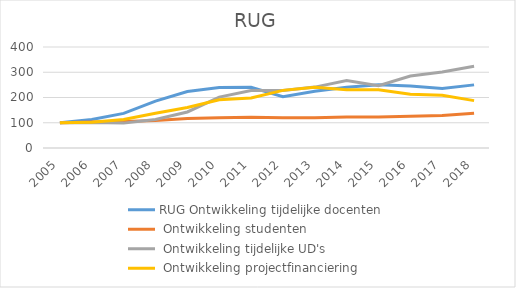
| Category | RUG Ontwikkeling tijdelijke docenten | RUG Ontwikkeling studenten | RUG Ontwikkeling tijdelijke UD's | RUG Ontwikkeling projectfinanciering |
|---|---|---|---|---|
| 2005.0 | 100 | 100 | 100 | 100 |
| 2006.0 | 113.043 | 103.266 | 101.471 | 102.313 |
| 2007.0 | 136.957 | 104.717 | 98.529 | 113.236 |
| 2008.0 | 185.87 | 109.385 | 113.235 | 137.719 |
| 2009.0 | 223.913 | 116.416 | 142.647 | 160.484 |
| 2010.0 | 239.13 | 120.198 | 201.471 | 191.391 |
| 2011.0 | 240.217 | 122.072 | 227.941 | 198.213 |
| 2012.0 | 203.261 | 119.352 | 227.941 | 228.209 |
| 2013.0 | 225 | 119.639 | 241.176 | 240.174 |
| 2014.0 | 240.217 | 123.121 | 267.647 | 230.37 |
| 2015.0 | 250 | 122.843 | 247.059 | 230.45 |
| 2016.0 | 245.652 | 125.422 | 285.294 | 213.138 |
| 2017.0 | 235.957 | 129.143 | 301.412 | 209.006 |
| 2018.0 | 250.022 | 137.32 | 323.779 | 187.611 |